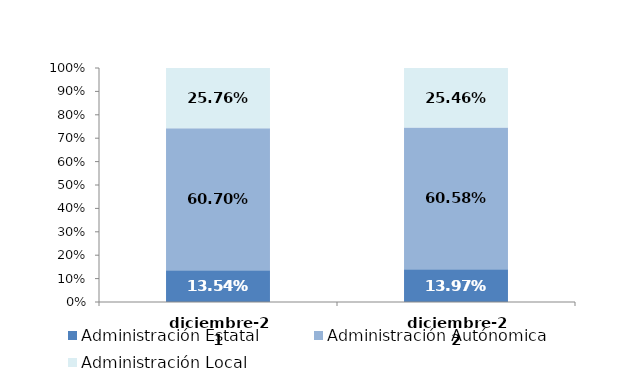
| Category | Administración Estatal | Administración Autónomica | Administración Local |
|---|---|---|---|
| 2021-12-01 | 0.135 | 0.607 | 0.258 |
| 2022-12-01 | 0.14 | 0.606 | 0.255 |